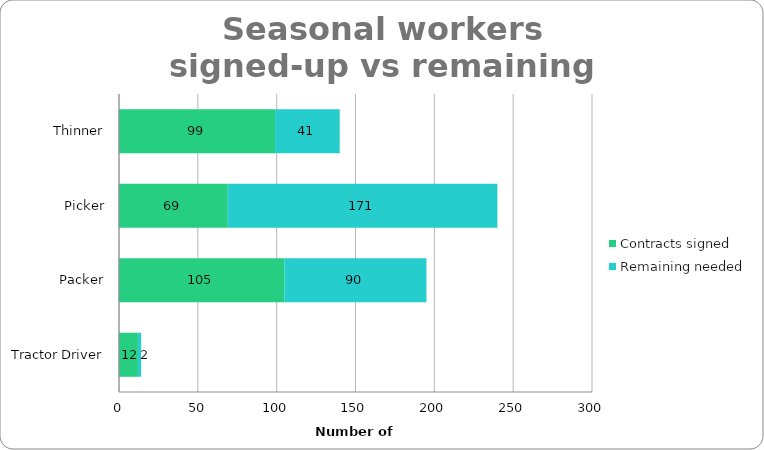
| Category | Contracts signed | Remaining needed |
|---|---|---|
| Thinner | 99 | 41 |
| Picker | 69 | 171 |
| Packer | 105 | 90 |
| Tractor Driver | 12 | 2 |